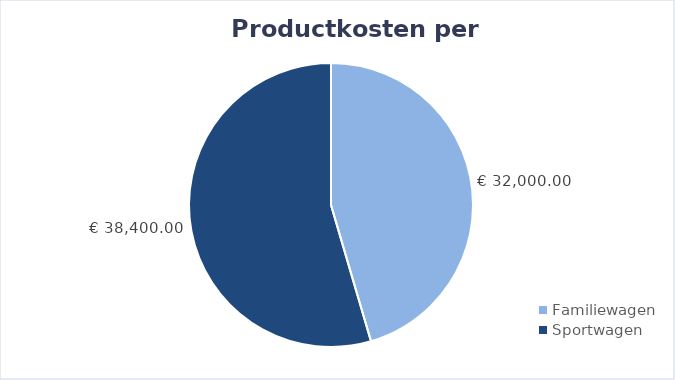
| Category | Series 0 |
|---|---|
| Familiewagen | 32000 |
| Sportwagen | 38400 |